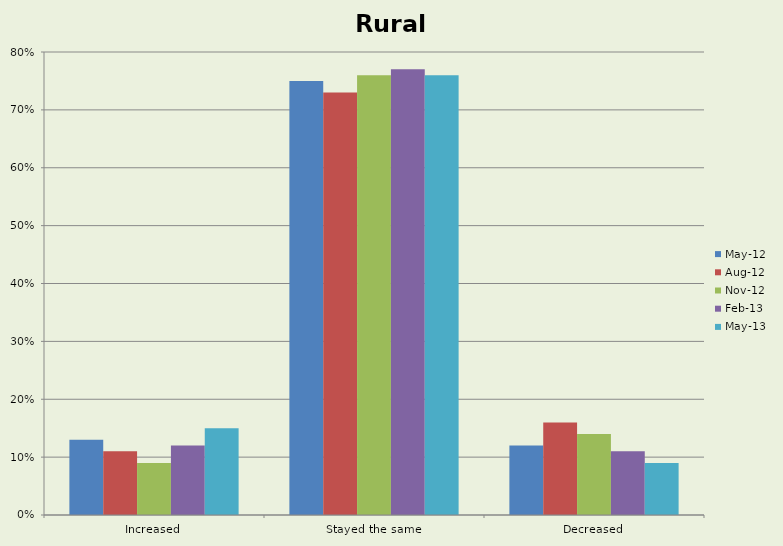
| Category | May-12 | Aug-12 | Nov-12 | Feb-13 | May-13 |
|---|---|---|---|---|---|
| Increased | 0.13 | 0.11 | 0.09 | 0.12 | 0.15 |
| Stayed the same | 0.75 | 0.73 | 0.76 | 0.77 | 0.76 |
| Decreased | 0.12 | 0.16 | 0.14 | 0.11 | 0.09 |